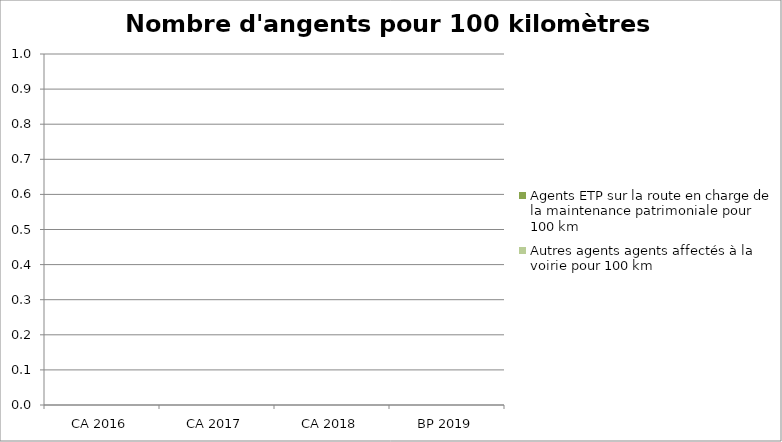
| Category | Agents ETP sur la route en charge de la maintenance patrimoniale pour 100 km | Autres agents agents affectés à la voirie pour 100 km |
|---|---|---|
| CA 2016 | 0 | 0 |
| CA 2017 | 0 | 0 |
| CA 2018 | 0 | 0 |
| BP 2019 | 0 | 0 |